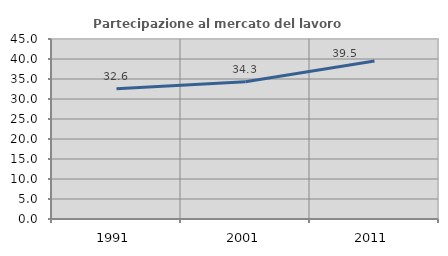
| Category | Partecipazione al mercato del lavoro  femminile |
|---|---|
| 1991.0 | 32.59 |
| 2001.0 | 34.312 |
| 2011.0 | 39.515 |